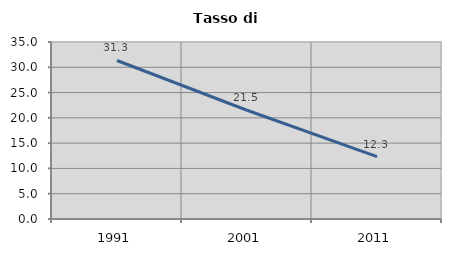
| Category | Tasso di disoccupazione   |
|---|---|
| 1991.0 | 31.342 |
| 2001.0 | 21.509 |
| 2011.0 | 12.327 |